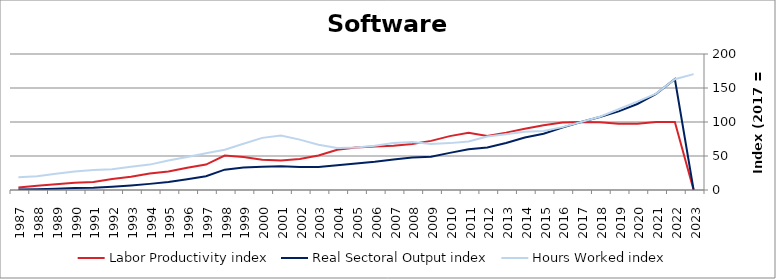
| Category | Labor Productivity index | Real Sectoral Output index | Hours Worked index |
|---|---|---|---|
| 2023.0 | 0 | 0 | 170.432 |
| 2022.0 | 100.146 | 163.057 | 162.819 |
| 2021.0 | 99.822 | 141.463 | 141.714 |
| 2020.0 | 97.302 | 126.51 | 130.018 |
| 2019.0 | 97.373 | 115.664 | 118.784 |
| 2018.0 | 99.542 | 107.331 | 107.825 |
| 2017.0 | 100 | 100 | 100 |
| 2016.0 | 99.213 | 91.707 | 92.435 |
| 2015.0 | 95.316 | 82.85 | 86.921 |
| 2014.0 | 90.125 | 77.165 | 85.62 |
| 2013.0 | 84.398 | 69.133 | 81.912 |
| 2012.0 | 79.461 | 62.571 | 78.744 |
| 2011.0 | 84.065 | 59.994 | 71.367 |
| 2010.0 | 79.211 | 54.607 | 68.939 |
| 2009.0 | 72.225 | 48.904 | 67.711 |
| 2008.0 | 67.589 | 47.663 | 70.519 |
| 2007.0 | 65.044 | 44.92 | 69.061 |
| 2006.0 | 63.933 | 41.562 | 65.009 |
| 2005.0 | 62.508 | 39.017 | 62.419 |
| 2004.0 | 59.105 | 36.478 | 61.718 |
| 2003.0 | 50.819 | 33.835 | 66.58 |
| 2002.0 | 45.435 | 33.672 | 74.111 |
| 2001.0 | 43.452 | 34.823 | 80.143 |
| 2000.0 | 44.52 | 34.129 | 76.659 |
| 1999.0 | 48.449 | 32.992 | 68.096 |
| 1998.0 | 50.548 | 29.933 | 59.217 |
| 1997.0 | 37.389 | 20.156 | 53.908 |
| 1996.0 | 32.689 | 15.816 | 48.382 |
| 1995.0 | 27.157 | 11.794 | 43.428 |
| 1994.0 | 24.135 | 9.013 | 37.345 |
| 1993.0 | 19.525 | 6.657 | 34.095 |
| 1992.0 | 16.126 | 4.912 | 30.462 |
| 1991.0 | 11.612 | 3.394 | 29.232 |
| 1990.0 | 10.693 | 2.915 | 27.258 |
| 1989.0 | 8.447 | 2.007 | 23.754 |
| 1988.0 | 6.08 | 1.227 | 20.178 |
| 1987.0 | 3.735 | 0.695 | 18.621 |